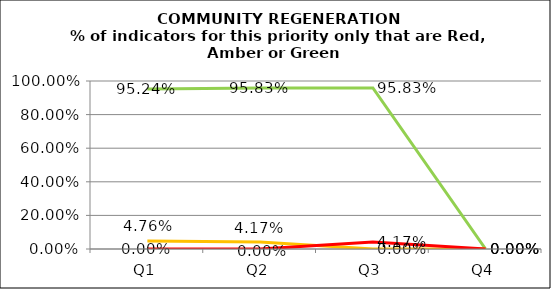
| Category | Green | Amber | Red |
|---|---|---|---|
| Q1 | 0.952 | 0.048 | 0 |
| Q2 | 0.958 | 0.042 | 0 |
| Q3 | 0.958 | 0 | 0.042 |
| Q4 | 0 | 0 | 0 |